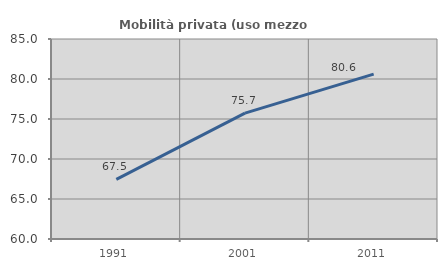
| Category | Mobilità privata (uso mezzo privato) |
|---|---|
| 1991.0 | 67.459 |
| 2001.0 | 75.728 |
| 2011.0 | 80.607 |